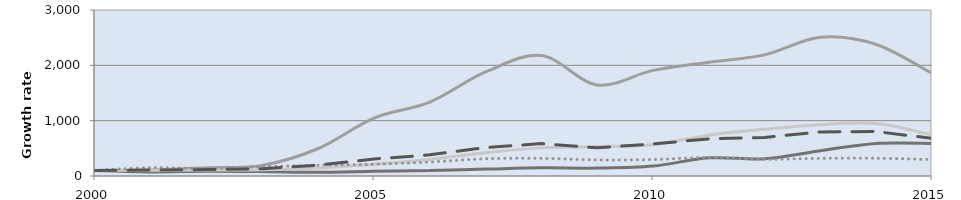
| Category | Armenia | Burkina Faso | Georgia | Morocco | Average |
|---|---|---|---|---|---|
| 2000.0 | 100 | 100 | 100 | 100 | 100 |
| 2001.0 | 107.909 | 74.13 | 105.739 | 150.922 | 107.334 |
| 2002.0 | 149.963 | 87.227 | 110.15 | 133.33 | 116.801 |
| 2003.0 | 191.881 | 79.821 | 112.606 | 167.125 | 132.853 |
| 2004.0 | 497.024 | 65.965 | 144.56 | 195.365 | 195.41 |
| 2005.0 | 1046.337 | 84.12 | 212.842 | 212.459 | 306.777 |
| 2006.0 | 1336.656 | 100.892 | 299.383 | 252.372 | 382.568 |
| 2007.0 | 1879.93 | 125.231 | 421.416 | 311.588 | 512.998 |
| 2008.0 | 2176.823 | 147.531 | 508.249 | 319.172 | 585.814 |
| 2009.0 | 1646.061 | 142.552 | 530.487 | 290.229 | 509.947 |
| 2010.0 | 1908.468 | 178.725 | 564.997 | 297.332 | 579.103 |
| 2011.0 | 2056.276 | 327.881 | 738.39 | 335.932 | 670.372 |
| 2012.0 | 2189.304 | 311.862 | 844.733 | 301.284 | 697.885 |
| 2013.0 | 2506.224 | 457.981 | 928.328 | 318.589 | 796.358 |
| 2014.0 | 2376.379 | 587.778 | 947.985 | 320.501 | 802.888 |
| 2015.0 | 1854.287 | 587.778 | 741.847 | 297.137 | 680.691 |